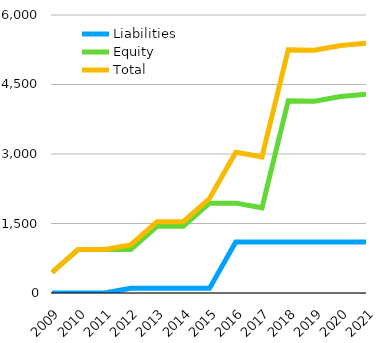
| Category | Liabilities  | Equity  | Total |
|---|---|---|---|
| 2009 | 0 | 443 | 443 |
| 2010 | 0 | 939 | 939 |
| 2011 | 0 | 939 | 939 |
| 2012 | 100 | 939 | 1039 |
| 2013 | 100 | 1439 | 1539 |
| 2014 | 100 | 1439 | 1539 |
| 2015 | 100 | 1939 | 2039 |
| 2016 | 1100 | 1939 | 3039 |
| 2017 | 1100 | 1839 | 2939 |
| 2018 | 1100 | 4151 | 5251 |
| 2019 | 1100 | 4140.3 | 5240.3 |
| 2020 | 1100 | 4241.1 | 5341.1 |
| 2021 | 1100 | 4293.1 | 5393.1 |